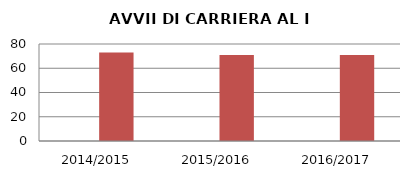
| Category | ANNO | NUMERO |
|---|---|---|
| 2014/2015 | 0 | 73 |
| 2015/2016 | 0 | 71 |
| 2016/2017 | 0 | 71 |